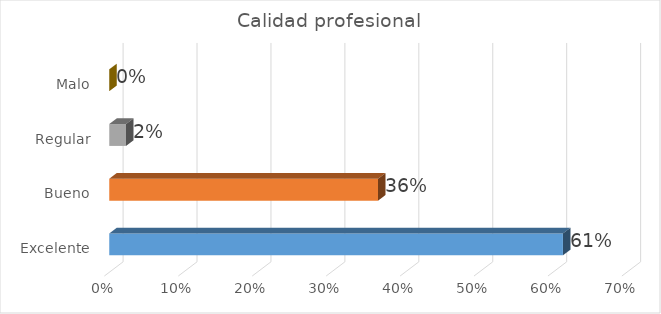
| Category | Series 0 |
|---|---|
| Excelente | 0.614 |
| Bueno | 0.364 |
| Regular | 0.023 |
| Malo | 0 |